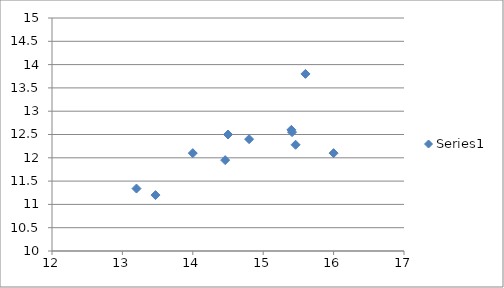
| Category | Series 0 |
|---|---|
| 14.0 | 12.1 |
| 15.6 | 13.8 |
| 14.5 | 12.5 |
| 14.46 | 11.95 |
| 15.41 | 12.55 |
| 15.46 | 12.28 |
| 14.8 | 12.4 |
| 16.0 | 12.1 |
| 15.4 | 12.6 |
| 13.47 | 11.2 |
| 13.2 | 11.34 |